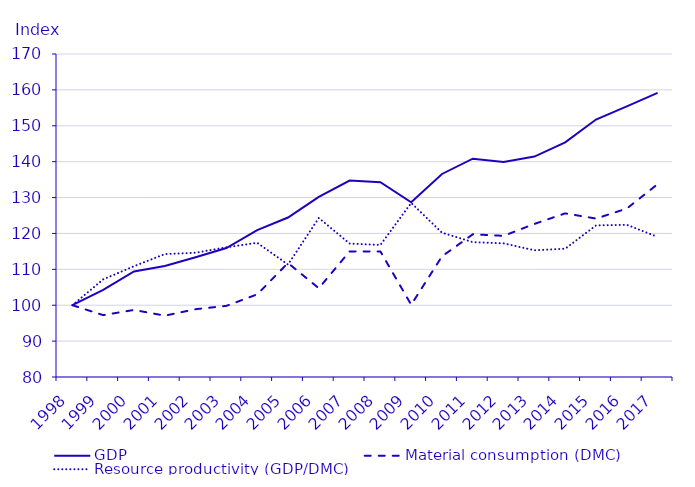
| Category | GDP | Material consumption (DMC) | Resource productivity (GDP/DMC) |
|---|---|---|---|
| 1998.0 | 100 | 100 | 100 |
| 1999.0 | 104.249 | 97.241 | 107.207 |
| 2000.0 | 109.408 | 98.687 | 110.864 |
| 2001.0 | 110.926 | 97.091 | 114.249 |
| 2002.0 | 113.354 | 98.892 | 114.624 |
| 2003.0 | 115.933 | 99.823 | 116.139 |
| 2004.0 | 120.941 | 103.025 | 117.39 |
| 2005.0 | 124.431 | 111.764 | 111.333 |
| 2006.0 | 130.197 | 104.732 | 124.314 |
| 2007.0 | 134.75 | 114.99 | 117.183 |
| 2008.0 | 134.294 | 114.985 | 116.793 |
| 2009.0 | 128.68 | 100.134 | 128.507 |
| 2010.0 | 136.571 | 113.618 | 120.201 |
| 2011.0 | 140.819 | 119.768 | 117.577 |
| 2012.0 | 139.909 | 119.331 | 117.244 |
| 2013.0 | 141.426 | 122.65 | 115.309 |
| 2014.0 | 145.372 | 125.596 | 115.746 |
| 2015.0 | 151.745 | 124.146 | 122.231 |
| 2016.0 | 155.387 | 126.936 | 122.413 |
| 2017.0 | 159.181 | 133.722 | 119.038 |